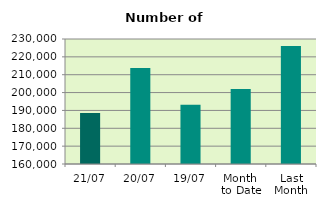
| Category | Series 0 |
|---|---|
| 21/07 | 188544 |
| 20/07 | 213728 |
| 19/07 | 193118 |
| Month 
to Date | 201976 |
| Last
Month | 226069.545 |